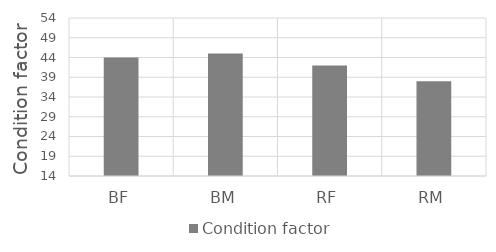
| Category | Condition factor |
|---|---|
| BF | 44 |
| BM | 45 |
| RF | 42 |
| RM | 38 |